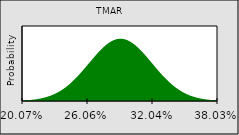
| Category | Series 0 |
|---|---|
| 0.200728751505825 | 0 |
| nan | 0 |
| nan | 0 |
| nan | 0 |
| nan | 0 |
| nan | 0.001 |
| nan | 0.001 |
| nan | 0.001 |
| nan | 0.001 |
| nan | 0.001 |
| nan | 0.001 |
| nan | 0.001 |
| nan | 0.002 |
| nan | 0.002 |
| nan | 0.002 |
| nan | 0.002 |
| nan | 0.003 |
| nan | 0.003 |
| nan | 0.004 |
| nan | 0.004 |
| nan | 0.005 |
| nan | 0.005 |
| nan | 0.006 |
| nan | 0.006 |
| nan | 0.007 |
| nan | 0.008 |
| nan | 0.008 |
| nan | 0.009 |
| nan | 0.01 |
| nan | 0.011 |
| nan | 0.012 |
| nan | 0.013 |
| nan | 0.014 |
| 0.26057625050194166 | 0.015 |
| nan | 0.016 |
| nan | 0.017 |
| nan | 0.017 |
| nan | 0.018 |
| nan | 0.019 |
| nan | 0.02 |
| nan | 0.021 |
| nan | 0.022 |
| nan | 0.022 |
| nan | 0.023 |
| nan | 0.023 |
| nan | 0.024 |
| nan | 0.024 |
| nan | 0.025 |
| nan | 0.025 |
| nan | 0.025 |
| nan | 0.025 |
| nan | 0.025 |
| nan | 0.025 |
| nan | 0.024 |
| nan | 0.024 |
| nan | 0.023 |
| nan | 0.023 |
| nan | 0.022 |
| nan | 0.022 |
| nan | 0.021 |
| nan | 0.02 |
| nan | 0.019 |
| nan | 0.018 |
| nan | 0.017 |
| nan | 0.017 |
| nan | 0.016 |
| 0.3204237494980583 | 0.015 |
| nan | 0.014 |
| nan | 0.013 |
| nan | 0.012 |
| nan | 0.011 |
| nan | 0.01 |
| nan | 0.009 |
| nan | 0.008 |
| nan | 0.008 |
| nan | 0.007 |
| nan | 0.006 |
| nan | 0.006 |
| nan | 0.005 |
| nan | 0.005 |
| nan | 0.004 |
| nan | 0.004 |
| nan | 0.003 |
| nan | 0.003 |
| nan | 0.002 |
| nan | 0.002 |
| nan | 0.002 |
| nan | 0.002 |
| nan | 0.001 |
| nan | 0.001 |
| nan | 0.001 |
| nan | 0.001 |
| nan | 0.001 |
| nan | 0.001 |
| nan | 0.001 |
| nan | 0 |
| nan | 0 |
| nan | 0 |
| nan | 0 |
| 0.38027124849417493 | 0 |